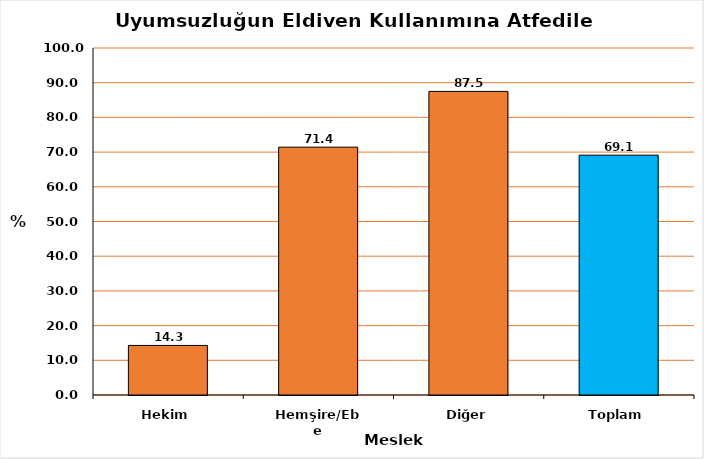
| Category | Series 0 |
|---|---|
| Hekim | 14.286 |
| Hemşire/Ebe | 71.429 |
| Diğer | 87.5 |
| Toplam | 69.118 |